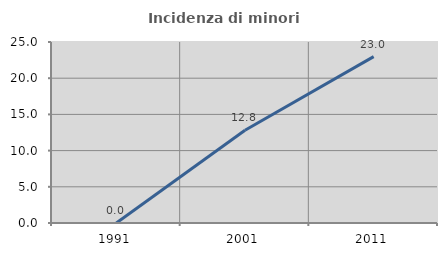
| Category | Incidenza di minori stranieri |
|---|---|
| 1991.0 | 0 |
| 2001.0 | 12.821 |
| 2011.0 | 22.981 |